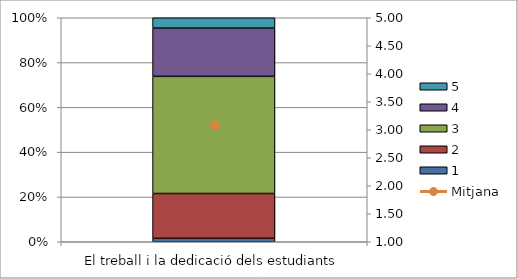
| Category | 1 | 2 | 3 | 4 | 5 |
|---|---|---|---|---|---|
| El treball i la dedicació dels estudiants | 1 | 13 | 34 | 14 | 3 |